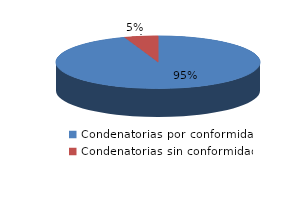
| Category | Series 0 |
|---|---|
| 0 | 89 |
| 1 | 5 |